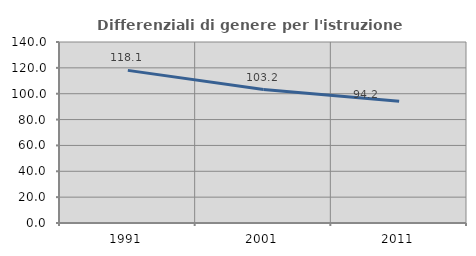
| Category | Differenziali di genere per l'istruzione superiore |
|---|---|
| 1991.0 | 118.051 |
| 2001.0 | 103.233 |
| 2011.0 | 94.186 |